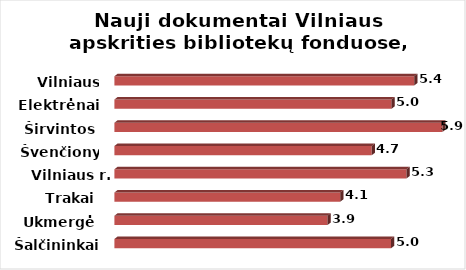
| Category | Series 0 |
|---|---|
| Šalčininkai | 5.01 |
| Ukmergė | 3.86 |
| Trakai | 4.09 |
| Vilniaus r. | 5.29 |
| Švenčionys | 4.66 |
| Širvintos | 5.94 |
| Elektrėnai | 5.02 |
| Vilniaus m. | 5.43 |